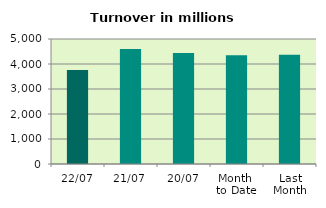
| Category | Series 0 |
|---|---|
| 22/07 | 3761.053 |
| 21/07 | 4600.14 |
| 20/07 | 4440.94 |
| Month 
to Date | 4354.343 |
| Last
Month | 4366.67 |